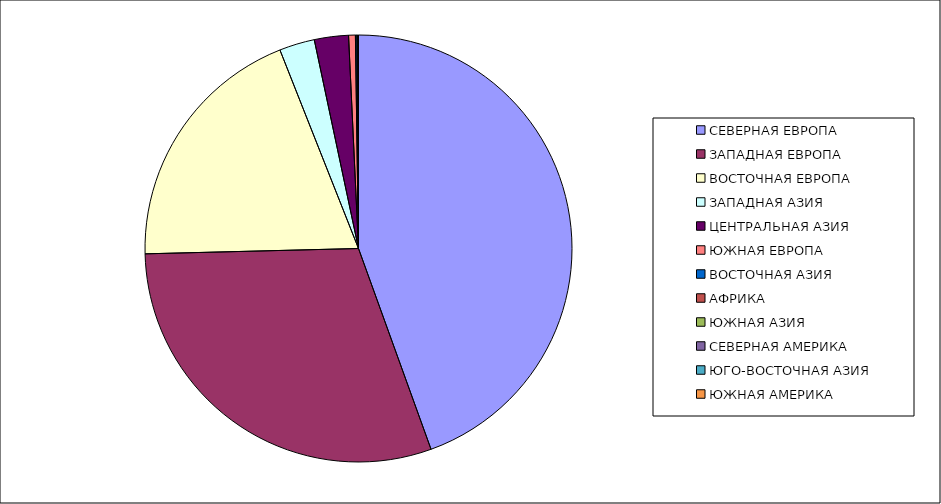
| Category | Оборот |
|---|---|
| СЕВЕРНАЯ ЕВРОПА | 44.482 |
| ЗАПАДНАЯ ЕВРОПА | 30.119 |
| ВОСТОЧНАЯ ЕВРОПА | 19.401 |
| ЗАПАДНАЯ АЗИЯ | 2.673 |
| ЦЕНТРАЛЬНАЯ АЗИЯ | 2.58 |
| ЮЖНАЯ ЕВРОПА | 0.513 |
| ВОСТОЧНАЯ АЗИЯ | 0.111 |
| АФРИКА | 0.056 |
| ЮЖНАЯ АЗИЯ | 0.038 |
| СЕВЕРНАЯ АМЕРИКА | 0.025 |
| ЮГО-ВОСТОЧНАЯ АЗИЯ | 0 |
| ЮЖНАЯ АМЕРИКА | 0 |